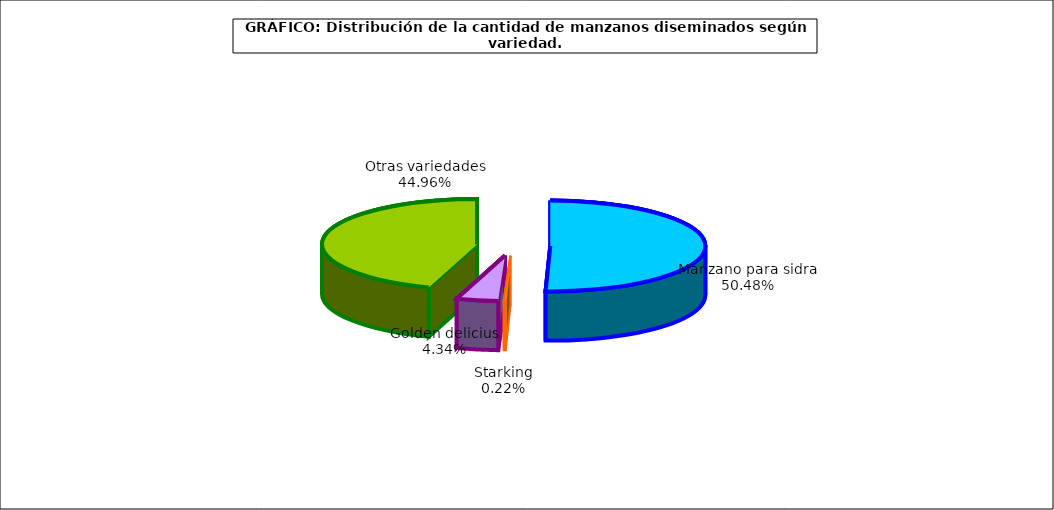
| Category | arboles |
|---|---|
| 0 | 696.045 |
| 1 | 3.014 |
| 2 | 59.785 |
| 3 | 619.881 |